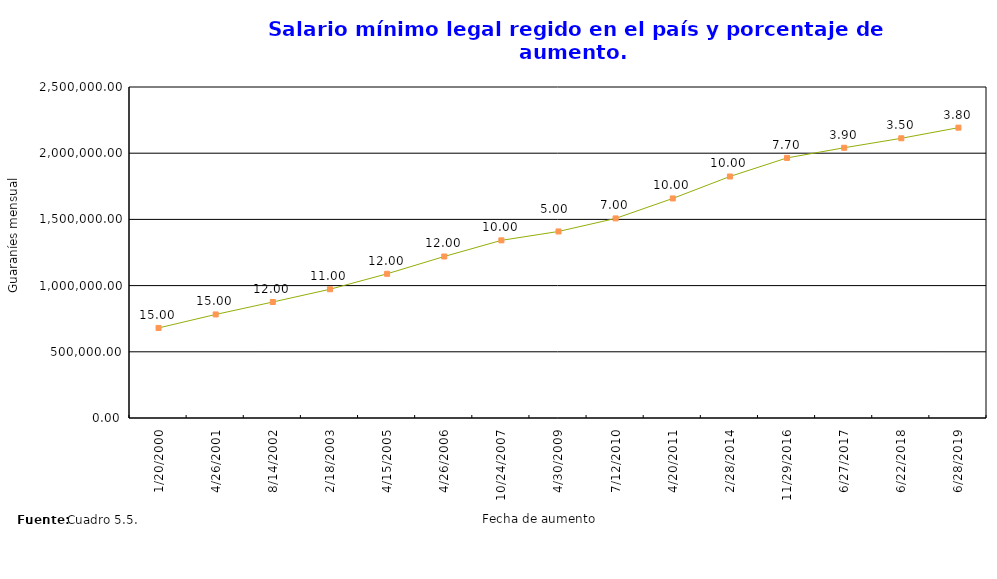
| Category | Guaraníes mensual | % de aumento |
|---|---|---|
| 1/20/00 | 680162 | 15 |
| 4/26/01 | 782186 | 15 |
| 8/14/02 | 876048 | 12 |
| 2/18/03 | 972413 | 11 |
| 4/15/05 | 1089103 | 12 |
| 4/26/06 | 1219795 | 12 |
| 10/24/07 | 1341795 | 10.002 |
| 4/30/09 | 1408864 | 4.998 |
| 7/12/10 | 1507484 | 7 |
| 4/20/11 | 1658232 | 10 |
| 2/28/14 | 1824055 | 10 |
| 11/29/16 | 1964507 | 7.7 |
| 6/27/17 | 2041123 | 3.9 |
| 6/22/18 | 2112562 | 3.5 |
| 6/28/19 | 2192839 | 3.8 |